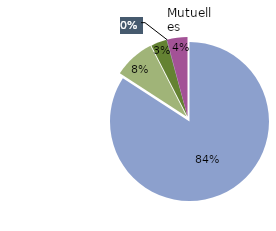
| Category | Sociétés d'assurance |
|---|---|
| Frais de soins  | 0.842 |
| Retraite, préretraite et indemnités de fin de carrière | 0.083 |
| Décès  | 0.032 |
| Nuptialité-natalité et perte d'emploi  | 0.001 |
| Autres dommages corporels* | 0.042 |